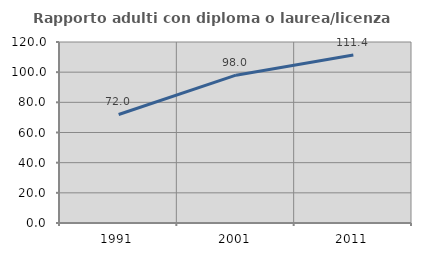
| Category | Rapporto adulti con diploma o laurea/licenza media  |
|---|---|
| 1991.0 | 71.963 |
| 2001.0 | 98.013 |
| 2011.0 | 111.377 |